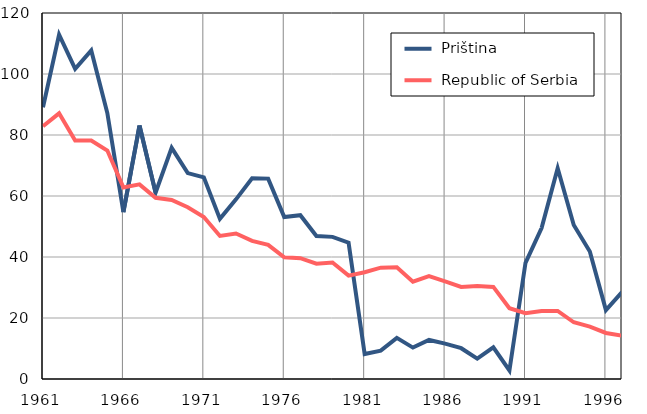
| Category |  Priština |  Republic of Serbia |
|---|---|---|
| 1961.0 | 89.1 | 82.9 |
| 1962.0 | 112.9 | 87.1 |
| 1963.0 | 101.7 | 78.2 |
| 1964.0 | 107.7 | 78.2 |
| 1965.0 | 87.2 | 74.9 |
| 1966.0 | 54.7 | 62.8 |
| 1967.0 | 83.1 | 63.8 |
| 1968.0 | 61.1 | 59.4 |
| 1969.0 | 75.8 | 58.7 |
| 1970.0 | 67.5 | 56.3 |
| 1971.0 | 66.1 | 53.1 |
| 1972.0 | 52.5 | 46.9 |
| 1973.0 | 58.9 | 47.7 |
| 1974.0 | 65.8 | 45.3 |
| 1975.0 | 65.7 | 44 |
| 1976.0 | 53.1 | 39.9 |
| 1977.0 | 53.7 | 39.6 |
| 1978.0 | 46.9 | 37.8 |
| 1979.0 | 46.6 | 38.2 |
| 1980.0 | 44.7 | 33.9 |
| 1981.0 | 8.2 | 35 |
| 1982.0 | 9.3 | 36.5 |
| 1983.0 | 13.5 | 36.6 |
| 1984.0 | 10.3 | 31.9 |
| 1985.0 | 12.8 | 33.7 |
| 1986.0 | 11.6 | 32 |
| 1987.0 | 10.1 | 30.2 |
| 1988.0 | 6.7 | 30.5 |
| 1989.0 | 10.4 | 30.2 |
| 1990.0 | 2.8 | 23.2 |
| 1991.0 | 38.1 | 21.6 |
| 1992.0 | 49.5 | 22.3 |
| 1993.0 | 69.1 | 22.3 |
| 1994.0 | 50.5 | 18.6 |
| 1995.0 | 41.8 | 17.2 |
| 1996.0 | 22.6 | 15.1 |
| 1997.0 | 28.5 | 14.2 |